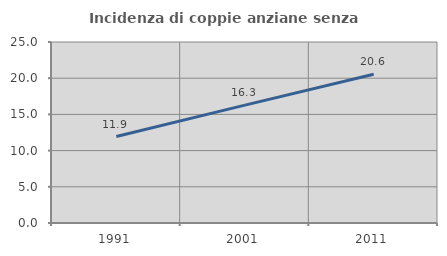
| Category | Incidenza di coppie anziane senza figli  |
|---|---|
| 1991.0 | 11.947 |
| 2001.0 | 16.279 |
| 2011.0 | 20.556 |